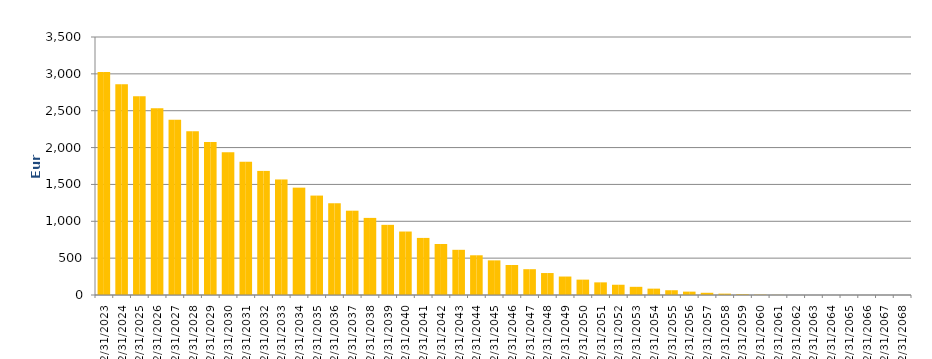
| Category | Series 1 | Series 0 |
|---|---|---|
| 12/31/23 | 3026.096 | 3026.096 |
| 12/31/24 | 2860.027 | 2860.027 |
| 12/31/25 | 2696.087 | 2696.087 |
| 12/31/26 | 2534.416 | 2534.416 |
| 12/31/27 | 2376.183 | 2376.183 |
| 12/31/28 | 2223.093 | 2223.093 |
| 12/31/29 | 2076.878 | 2076.878 |
| 12/31/30 | 1937.993 | 1937.993 |
| 12/31/31 | 1806.722 | 1806.722 |
| 12/31/32 | 1683.404 | 1683.404 |
| 12/31/33 | 1567.439 | 1567.439 |
| 12/31/34 | 1456.298 | 1456.298 |
| 12/31/35 | 1348.817 | 1348.817 |
| 12/31/36 | 1244.624 | 1244.624 |
| 12/31/37 | 1143.634 | 1143.634 |
| 12/31/38 | 1045.95 | 1045.95 |
| 12/31/39 | 951.651 | 951.651 |
| 12/31/40 | 861.022 | 861.022 |
| 12/31/41 | 774.479 | 774.479 |
| 12/31/42 | 691.763 | 691.763 |
| 12/31/43 | 613.031 | 613.031 |
| 12/31/44 | 538.719 | 538.719 |
| 12/31/45 | 469.847 | 469.847 |
| 12/31/46 | 407.236 | 407.236 |
| 12/31/47 | 350.084 | 350.084 |
| 12/31/48 | 297.886 | 297.886 |
| 12/31/49 | 250.495 | 250.495 |
| 12/31/50 | 208.438 | 208.438 |
| 12/31/51 | 171.438 | 171.438 |
| 12/31/52 | 139.116 | 139.116 |
| 12/31/53 | 110.959 | 110.959 |
| 12/31/54 | 86.311 | 86.311 |
| 12/31/55 | 64.669 | 64.669 |
| 12/31/56 | 45.799 | 45.799 |
| 12/31/57 | 30.075 | 30.075 |
| 12/31/58 | 18.467 | 18.467 |
| 12/31/59 | 10.042 | 10.042 |
| 12/31/60 | 4.395 | 4.395 |
| 12/31/61 | 1.585 | 1.585 |
| 12/31/62 | 0.425 | 0.425 |
| 12/31/63 | 0.024 | 0.024 |
| 12/31/64 | 0.018 | 0.018 |
| 12/31/65 | 0.013 | 0.013 |
| 12/31/66 | 0.01 | 0.01 |
| 12/31/67 | 0.006 | 0.006 |
| 12/31/68 | 0.003 | 0.003 |